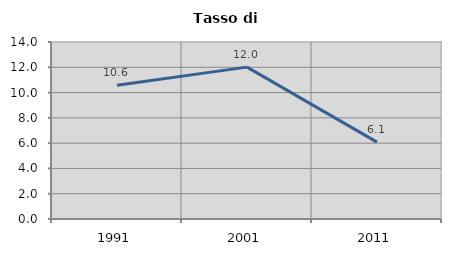
| Category | Tasso di disoccupazione   |
|---|---|
| 1991.0 | 10.58 |
| 2001.0 | 12.012 |
| 2011.0 | 6.077 |